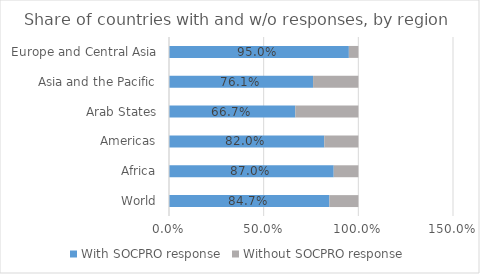
| Category | With SOCPRO response | Without SOCPRO response |
|---|---|---|
| World | 0.847 | 0.153 |
| Africa | 0.87 | 0.13 |
| Americas | 0.82 | 0.18 |
| Arab States | 0.667 | 0.333 |
| Asia and the Pacific | 0.761 | 0.239 |
| Europe and Central Asia | 0.95 | 0.05 |